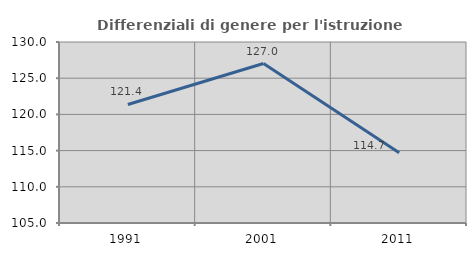
| Category | Differenziali di genere per l'istruzione superiore |
|---|---|
| 1991.0 | 121.37 |
| 2001.0 | 127.025 |
| 2011.0 | 114.687 |